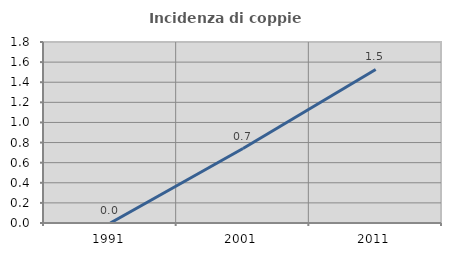
| Category | Incidenza di coppie miste |
|---|---|
| 1991.0 | 0 |
| 2001.0 | 0.741 |
| 2011.0 | 1.527 |